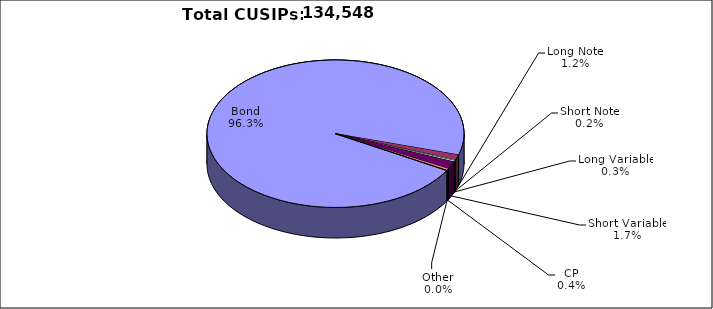
| Category | CUSIPs |
|---|---|
| Bond | 129576 |
| Long Note | 1587 |
| Short Note | 217 |
| Long Variable | 360 |
| Short Variable | 2221 |
| CP | 521 |
| Other | 66 |